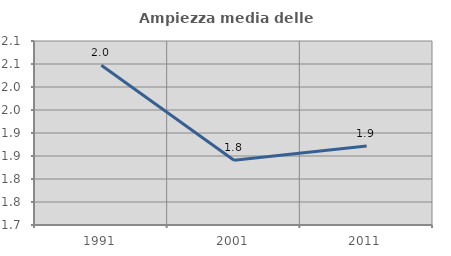
| Category | Ampiezza media delle famiglie |
|---|---|
| 1991.0 | 2.047 |
| 2001.0 | 1.841 |
| 2011.0 | 1.872 |